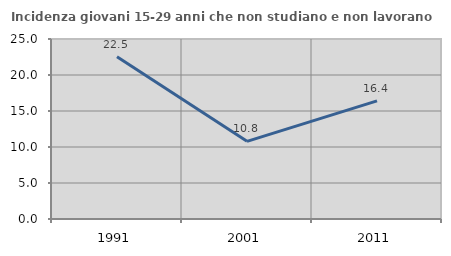
| Category | Incidenza giovani 15-29 anni che non studiano e non lavorano  |
|---|---|
| 1991.0 | 22.543 |
| 2001.0 | 10.785 |
| 2011.0 | 16.408 |